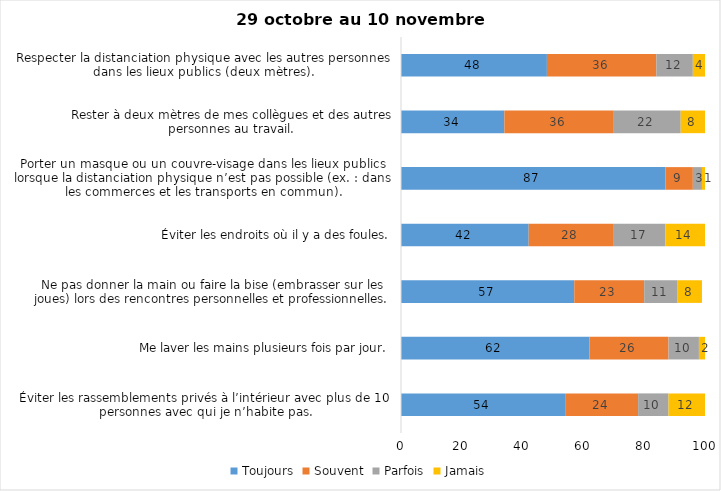
| Category | Toujours | Souvent | Parfois | Jamais |
|---|---|---|---|---|
| Éviter les rassemblements privés à l’intérieur avec plus de 10 personnes avec qui je n’habite pas. | 54 | 24 | 10 | 12 |
| Me laver les mains plusieurs fois par jour. | 62 | 26 | 10 | 2 |
| Ne pas donner la main ou faire la bise (embrasser sur les joues) lors des rencontres personnelles et professionnelles. | 57 | 23 | 11 | 8 |
| Éviter les endroits où il y a des foules. | 42 | 28 | 17 | 14 |
| Porter un masque ou un couvre-visage dans les lieux publics lorsque la distanciation physique n’est pas possible (ex. : dans les commerces et les transports en commun). | 87 | 9 | 3 | 1 |
| Rester à deux mètres de mes collègues et des autres personnes au travail. | 34 | 36 | 22 | 8 |
| Respecter la distanciation physique avec les autres personnes dans les lieux publics (deux mètres). | 48 | 36 | 12 | 4 |